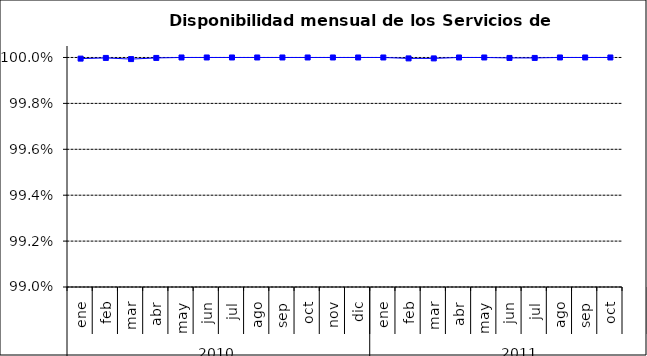
| Category | SCL * |
|---|---|
| 0 | 1 |
| 1 | 1 |
| 2 | 1 |
| 3 | 1 |
| 4 | 1 |
| 5 | 1 |
| 6 | 1 |
| 7 | 1 |
| 8 | 1 |
| 9 | 1 |
| 10 | 1 |
| 11 | 1 |
| 12 | 1 |
| 13 | 1 |
| 14 | 1 |
| 15 | 1 |
| 16 | 1 |
| 17 | 1 |
| 18 | 1 |
| 19 | 1 |
| 20 | 1 |
| 21 | 1 |